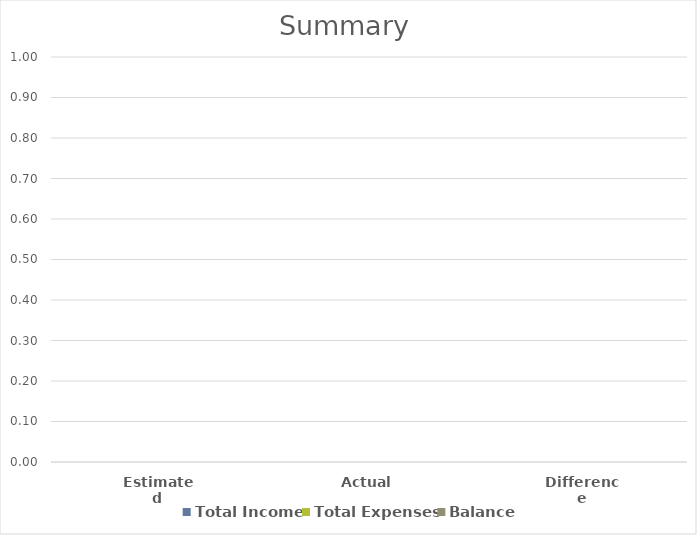
| Category | Total Income | Total Expenses | Balance |
|---|---|---|---|
| Estimated | 0 | 0 | 0 |
| Actual | 0 | 0 | 0 |
| Difference | 0 | 0 | 0 |